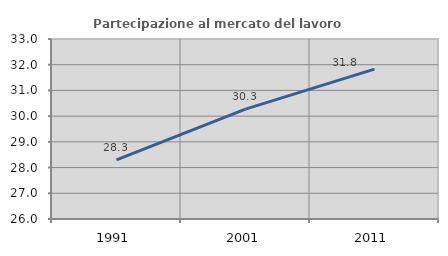
| Category | Partecipazione al mercato del lavoro  femminile |
|---|---|
| 1991.0 | 28.296 |
| 2001.0 | 30.272 |
| 2011.0 | 31.831 |